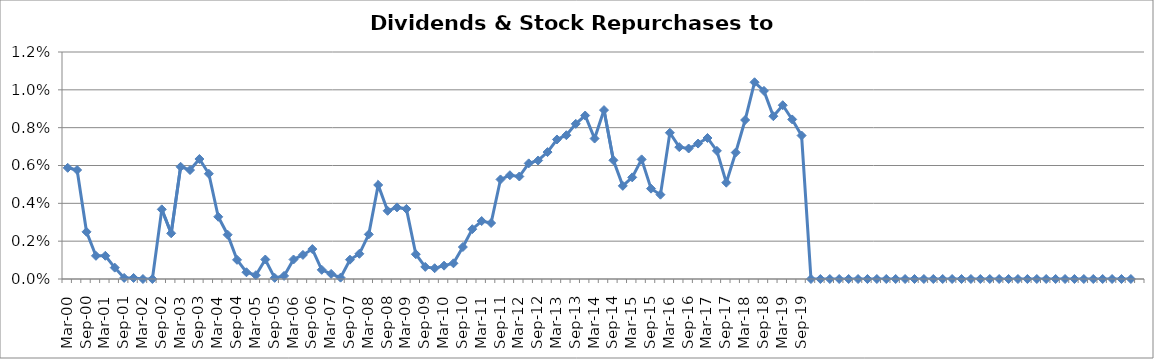
| Category | Dividends & Stock Repurchases to Revenue% |
|---|---|
| Mar-00 | 0.006 |
| Jun-00 | 0.006 |
| Sep-00 | 0.002 |
| Dec-00 | 0.001 |
| Mar-01 | 0.001 |
| Jun-01 | 0.001 |
| Sep-01 | 0 |
| Dec-01 | 0 |
| Mar-02 | 0 |
| Jun-02 | 0 |
| Sep-02 | 0.004 |
| Dec-02 | 0.002 |
| Mar-03 | 0.006 |
| Jun-03 | 0.006 |
| Sep-03 | 0.006 |
| Dec-03 | 0.006 |
| Mar-04 | 0.003 |
| Jun-04 | 0.002 |
| Sep-04 | 0.001 |
| Dec-04 | 0 |
| Mar-05 | 0 |
| Jun-05 | 0.001 |
| Sep-05 | 0 |
| Dec-05 | 0 |
| Mar-06 | 0.001 |
| Jun-06 | 0.001 |
| Sep-06 | 0.002 |
| Dec-06 | 0 |
| Mar-07 | 0 |
| Jun-07 | 0 |
| Sep-07 | 0.001 |
| Dec-07 | 0.001 |
| Mar-08 | 0.002 |
| Jun-08 | 0.005 |
| Sep-08 | 0.004 |
| Dec-08 | 0.004 |
| Mar-09 | 0.004 |
| Jun-09 | 0.001 |
| Sep-09 | 0.001 |
| Dec-09 | 0.001 |
| Mar-10 | 0.001 |
| Jun-10 | 0.001 |
| Sep-10 | 0.002 |
| Dec-10 | 0.003 |
| Mar-11 | 0.003 |
| Jun-11 | 0.003 |
| Sep-11 | 0.005 |
| Dec-11 | 0.005 |
| Mar-12 | 0.005 |
| Jun-12 | 0.006 |
| Sep-12 | 0.006 |
| Dec-12 | 0.007 |
| Mar-13 | 0.007 |
| Jun-13 | 0.008 |
| Sep-13 | 0.008 |
| Dec-13 | 0.009 |
| Mar-14 | 0.007 |
| Jun-14 | 0.009 |
| Sep-14 | 0.006 |
| Dec-14 | 0.005 |
| Mar-15 | 0.005 |
| Jun-15 | 0.006 |
| Sep-15 | 0.005 |
| Dec-15 | 0.004 |
| Mar-16 | 0.008 |
| Jun-16 | 0.007 |
| Sep-16 | 0.007 |
| Dec-16 | 0.007 |
| Mar-17 | 0.007 |
| Jun-17 | 0.007 |
| Sep-17 | 0.005 |
| Dec-17 | 0.007 |
| Mar-18 | 0.008 |
| Jun-18 | 0.01 |
| Sep-18 | 0.01 |
| Dec-18 | 0.009 |
| Mar-19 | 0.009 |
| Jun-19 | 0.008 |
| Sep-19 | 0.008 |